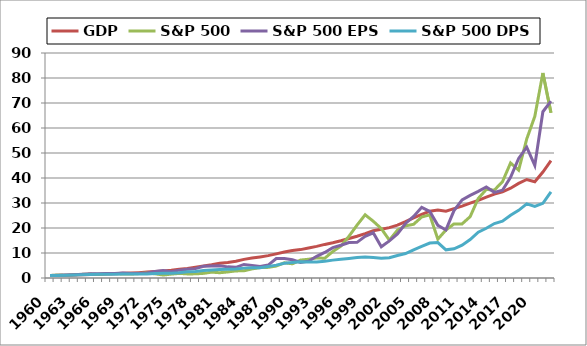
| Category | GDP | S&P 500 | S&P 500 EPS | S&P 500 DPS |
|---|---|---|---|---|
| 1960.0 | 1 | 1 | 1 | 1 |
| 1961.0 | 1.037 | 1.231 | 1.086 | 1.029 |
| 1962.0 | 1.113 | 1.086 | 1.181 | 1.083 |
| 1963.0 | 1.175 | 1.291 | 1.332 | 1.185 |
| 1964.0 | 1.262 | 1.458 | 1.535 | 1.304 |
| 1965.0 | 1.369 | 1.591 | 1.707 | 1.427 |
| 1966.0 | 1.5 | 1.382 | 1.745 | 1.455 |
| 1967.0 | 1.586 | 1.66 | 1.76 | 1.504 |
| 1968.0 | 1.734 | 1.787 | 1.844 | 1.536 |
| 1969.0 | 1.876 | 1.584 | 1.967 | 1.635 |
| 1970.0 | 1.979 | 1.586 | 1.776 | 1.609 |
| 1971.0 | 2.148 | 1.757 | 1.796 | 1.597 |
| 1972.0 | 2.358 | 2.031 | 1.99 | 1.609 |
| 1973.0 | 2.628 | 1.679 | 2.565 | 1.821 |
| 1974.0 | 2.849 | 1.18 | 3.014 | 1.879 |
| 1975.0 | 3.106 | 1.552 | 2.485 | 1.884 |
| 1976.0 | 3.454 | 1.849 | 3.141 | 2.131 |
| 1977.0 | 3.838 | 1.637 | 3.503 | 2.452 |
| 1978.0 | 4.336 | 1.654 | 3.751 | 2.614 |
| 1979.0 | 4.844 | 1.858 | 4.689 | 3.012 |
| 1980.0 | 5.268 | 2.336 | 4.83 | 3.247 |
| 1981.0 | 5.913 | 2.109 | 4.893 | 3.445 |
| 1982.0 | 6.165 | 2.42 | 4.455 | 3.499 |
| 1983.0 | 6.7 | 2.838 | 4.284 | 3.596 |
| 1984.0 | 7.444 | 2.878 | 5.427 | 3.95 |
| 1985.0 | 8 | 3.636 | 5.052 | 4.137 |
| 1986.0 | 8.444 | 4.167 | 4.651 | 4.131 |
| 1987.0 | 8.952 | 4.252 | 5.168 | 4.626 |
| 1988.0 | 9.655 | 4.779 | 7.773 | 5.158 |
| 1989.0 | 10.401 | 6.082 | 7.837 | 5.921 |
| 1990.0 | 10.994 | 5.683 | 7.299 | 6.233 |
| 1991.0 | 11.354 | 7.178 | 6.22 | 6.546 |
| 1992.0 | 12.022 | 7.498 | 6.726 | 6.377 |
| 1993.0 | 12.645 | 8.027 | 8.669 | 6.403 |
| 1994.0 | 13.436 | 7.903 | 10.232 | 6.745 |
| 1995.0 | 14.086 | 10.599 | 12.149 | 7.149 |
| 1996.0 | 14.885 | 12.747 | 13.093 | 7.514 |
| 1997.0 | 15.815 | 16.7 | 14.208 | 7.833 |
| 1998.0 | 16.709 | 21.154 | 14.266 | 8.175 |
| 1999.0 | 17.757 | 25.284 | 16.654 | 8.434 |
| 2000.0 | 18.9 | 22.72 | 18.089 | 8.21 |
| 2001.0 | 19.51 | 19.757 | 12.52 | 7.944 |
| 2002.0 | 20.15 | 15.141 | 14.837 | 8.115 |
| 2003.0 | 21.122 | 19.135 | 17.624 | 9.023 |
| 2004.0 | 22.525 | 20.856 | 21.811 | 9.794 |
| 2005.0 | 24.041 | 21.482 | 24.637 | 11.294 |
| 2006.0 | 25.472 | 24.407 | 28.269 | 12.642 |
| 2007.0 | 26.686 | 25.269 | 26.599 | 13.994 |
| 2008.0 | 27.231 | 15.544 | 21.073 | 14.156 |
| 2009.0 | 26.693 | 19.189 | 19.223 | 11.259 |
| 2010.0 | 27.746 | 21.642 | 26.96 | 11.668 |
| 2011.0 | 28.762 | 21.642 | 31.275 | 13.131 |
| 2012.0 | 29.968 | 24.543 | 33.022 | 15.362 |
| 2013.0 | 31.054 | 31.808 | 34.627 | 18.309 |
| 2014.0 | 32.359 | 35.431 | 36.419 | 19.904 |
| 2015.0 | 33.567 | 35.174 | 34.263 | 21.781 |
| 2016.0 | 34.469 | 38.527 | 35.081 | 22.725 |
| 2017.0 | 35.915 | 46.009 | 40.263 | 25.097 |
| 2018.0 | 37.846 | 43.14 | 47.804 | 27.055 |
| 2019.0 | 39.405 | 55.598 | 52.319 | 29.674 |
| 2020.0 | 38.522 | 64.637 | 45.039 | 28.614 |
| 2021.0 | 42.401 | 82.02 | 66.508 | 29.876 |
| 2022.0 | 46.944 | 66.073 | 70.733 | 34.488 |